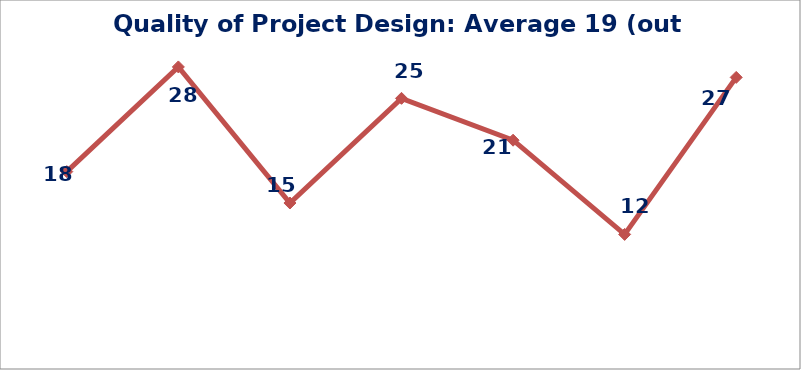
| Category | Impact and Dissemination |
|---|---|
| 0 | 18 |
| 1 | 28 |
| 2 | 15 |
| 3 | 25 |
| 4 | 21 |
| 5 | 12 |
| 6 | 27 |